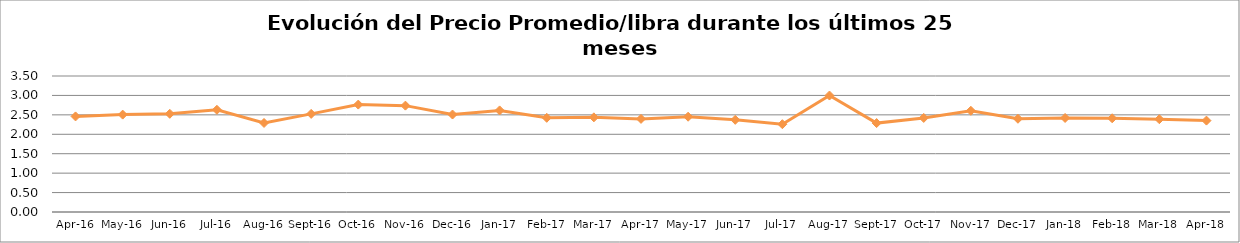
| Category | Series 0 |
|---|---|
| 2016-04-01 | 2.46 |
| 2016-05-01 | 2.506 |
| 2016-06-01 | 2.527 |
| 2016-07-01 | 2.631 |
| 2016-08-01 | 2.292 |
| 2016-09-01 | 2.525 |
| 2016-10-01 | 2.764 |
| 2016-11-01 | 2.737 |
| 2016-12-01 | 2.508 |
| 2017-01-01 | 2.615 |
| 2017-02-01 | 2.424 |
| 2017-03-01 | 2.436 |
| 2017-04-01 | 2.396 |
| 2017-05-01 | 2.452 |
| 2017-06-01 | 2.372 |
| 2017-07-01 | 2.26 |
| 2017-08-01 | 2.997 |
| 2017-09-01 | 2.288 |
| 2017-10-01 | 2.421 |
| 2017-11-01 | 2.605 |
| 2017-12-01 | 2.4 |
| 2018-01-01 | 2.42 |
| 2018-02-01 | 2.412 |
| 2018-03-01 | 2.388 |
| 2018-04-01 | 2.352 |